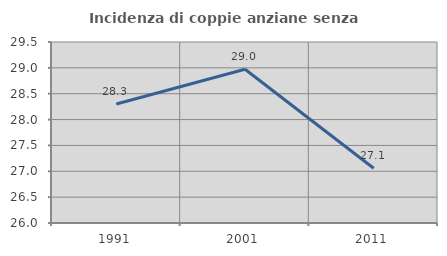
| Category | Incidenza di coppie anziane senza figli  |
|---|---|
| 1991.0 | 28.302 |
| 2001.0 | 28.972 |
| 2011.0 | 27.059 |